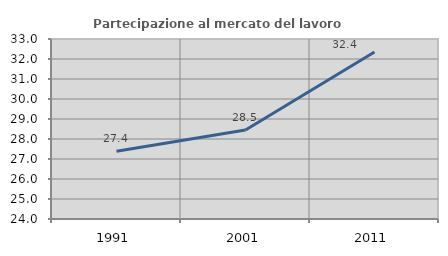
| Category | Partecipazione al mercato del lavoro  femminile |
|---|---|
| 1991.0 | 27.386 |
| 2001.0 | 28.452 |
| 2011.0 | 32.353 |